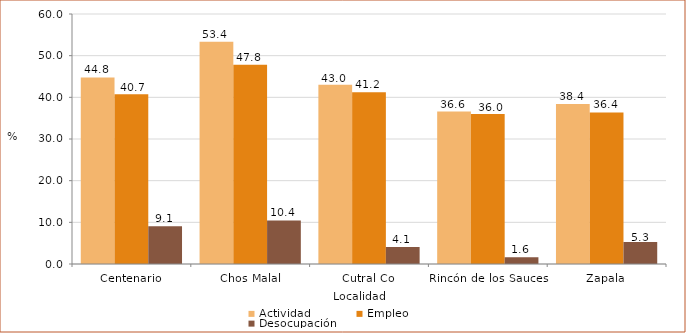
| Category | Actividad | Empleo | Desocupación |
|---|---|---|---|
| Centenario | 44.785 | 40.73 | 9.053 |
| Chos Malal | 53.363 | 47.792 | 10.44 |
| Cutral Co | 43.03 | 41.247 | 4.1 |
| Rincón de los Sauces | 36.583 | 35.985 | 1.6 |
| Zapala | 38.415 | 36.373 | 5.3 |